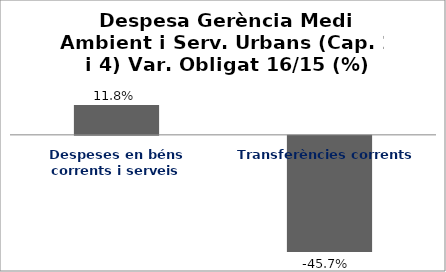
| Category | Series 0 |
|---|---|
| Despeses en béns corrents i serveis | 0.118 |
| Transferències corrents | -0.457 |